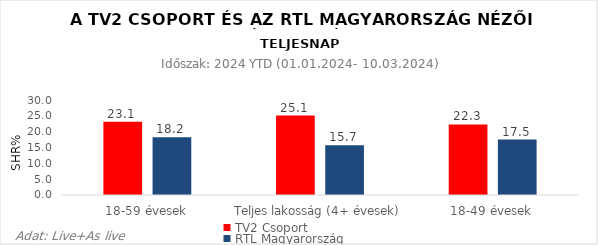
| Category | TV2 Csoport | RTL Magyarország |
|---|---|---|
| 18-59 évesek | 23.1 | 18.2 |
| Teljes lakosság (4+ évesek) | 25.1 | 15.7 |
| 18-49 évesek | 22.3 | 17.5 |